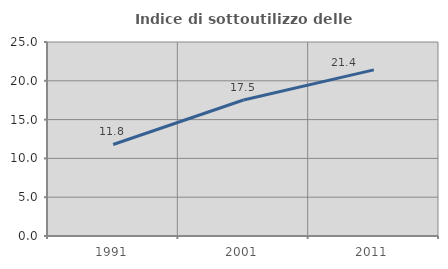
| Category | Indice di sottoutilizzo delle abitazioni  |
|---|---|
| 1991.0 | 11.793 |
| 2001.0 | 17.526 |
| 2011.0 | 21.406 |